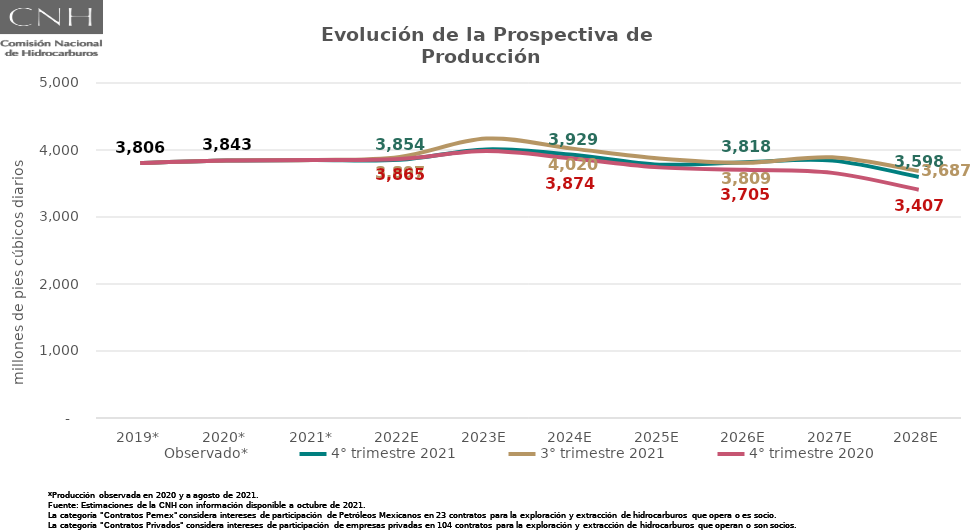
| Category | Observado* | 4° trimestre 2021 | 3° trimestre 2021 | 4° trimestre 2020 |
|---|---|---|---|---|
| 2019* | 3805.803 | 3805.803 | 3805.803 | 3805.803 |
| 2020* | 3843.294 | 3843.294 | 3843.294 | 3843.294 |
| 2021* | 3849.199 | 3849.199 | 3849.199 | 3849.199 |
| 2022E | 3853.981 | 3853.981 | 3897.359 | 3864.801 |
| 2023E | 4008.421 | 4008.421 | 4171.053 | 3984.204 |
| 2024E | 3929.344 | 3929.344 | 4020.436 | 3873.902 |
| 2025E | 3781.721 | 3781.721 | 3871.76 | 3740.671 |
| 2026E | 3818.195 | 3818.195 | 3808.537 | 3704.684 |
| 2027E | 3841.453 | 3841.453 | 3890.923 | 3658.43 |
| 2028E | 3597.706 | 3597.706 | 3686.74 | 3407.416 |